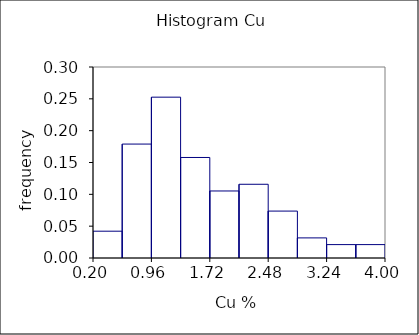
| Category | Series 0 |
|---|---|
| 0.2 | 0 |
| 0.2 | 0.042 |
| 0.58 | 0.042 |
| 0.58 | 0 |
| 0.58 | 0 |
| 0.58 | 0.179 |
| 0.96 | 0.179 |
| 0.96 | 0 |
| 0.96 | 0 |
| 0.96 | 0.253 |
| 1.34 | 0.253 |
| 1.34 | 0 |
| 1.34 | 0 |
| 1.34 | 0.158 |
| 1.72 | 0.158 |
| 1.72 | 0 |
| 1.72 | 0 |
| 1.72 | 0.105 |
| 2.1 | 0.105 |
| 2.1 | 0 |
| 2.1 | 0 |
| 2.1 | 0.116 |
| 2.48 | 0.116 |
| 2.48 | 0 |
| 2.48 | 0 |
| 2.48 | 0.074 |
| 2.86 | 0.074 |
| 2.86 | 0 |
| 2.86 | 0 |
| 2.86 | 0.032 |
| 3.24 | 0.032 |
| 3.24 | 0 |
| 3.24 | 0 |
| 3.24 | 0.021 |
| 3.62 | 0.021 |
| 3.62 | 0 |
| 3.62 | 0 |
| 3.62 | 0.021 |
| 4.0 | 0.021 |
| 4.0 | 0 |